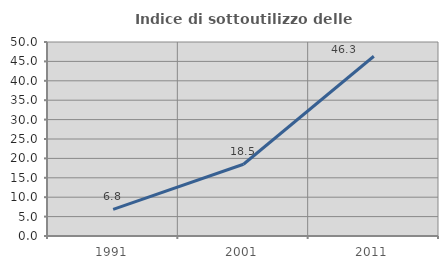
| Category | Indice di sottoutilizzo delle abitazioni  |
|---|---|
| 1991.0 | 6.849 |
| 2001.0 | 18.485 |
| 2011.0 | 46.329 |